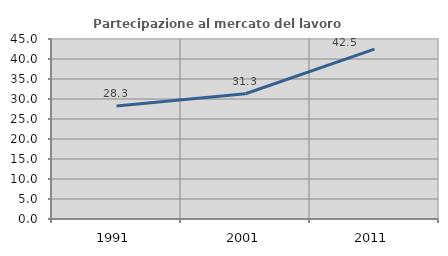
| Category | Partecipazione al mercato del lavoro  femminile |
|---|---|
| 1991.0 | 28.257 |
| 2001.0 | 31.317 |
| 2011.0 | 42.462 |